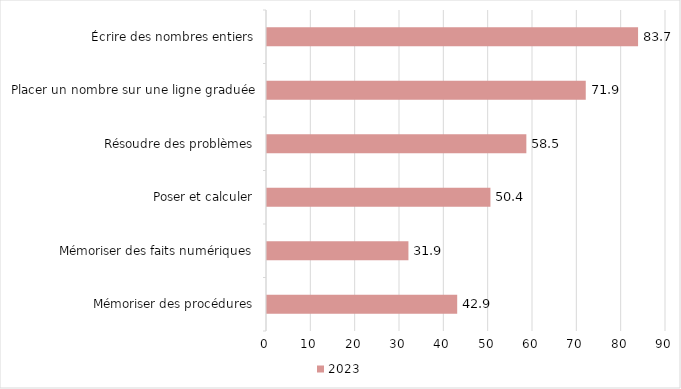
| Category | 2023 |
|---|---|
| Mémoriser des procédures | 42.9 |
| Mémoriser des faits numériques | 31.9 |
| Poser et calculer | 50.4 |
| Résoudre des problèmes | 58.5 |
| Placer un nombre sur une ligne graduée | 71.9 |
| Écrire des nombres entiers | 83.7 |